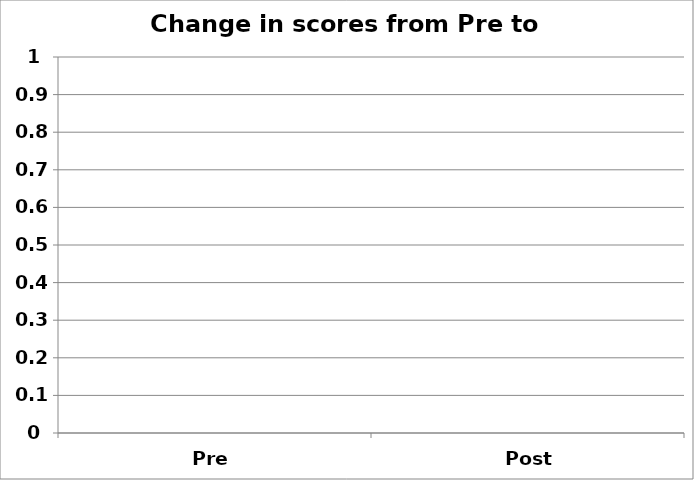
| Category | Change in scores from Pre to Post |
|---|---|
| Pre | 0 |
| Post | 0 |